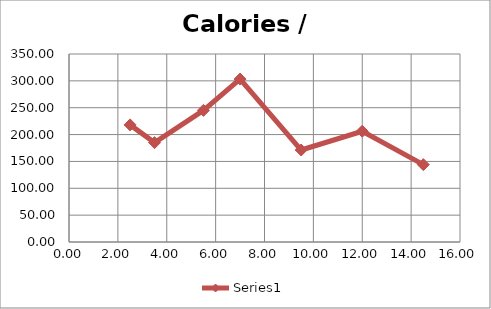
| Category | Series 0 |
|---|---|
| 2.5 | 218.016 |
| 3.5 | 185 |
| 5.5 | 245 |
| 7.0 | 303.36 |
| 9.5 | 171.264 |
| 12.0 | 206.208 |
| 14.5 | 144 |